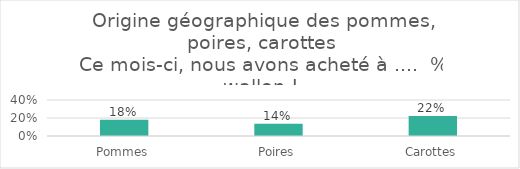
| Category | Series 0 |
|---|---|
| Pommes | 0.181 |
| Poires | 0.136 |
| Carottes | 0.223 |